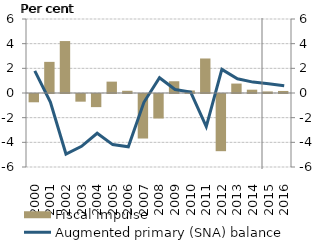
| Category | Fiscal impulse |
|---|---|
| 0 | -0.672 |
| 1900-01-01 | 2.524 |
| 1900-01-02 | 4.211 |
| 1900-01-03 | -0.622 |
| 1900-01-04 | -1.064 |
| 1900-01-05 | 0.922 |
| 1900-01-06 | 0.18 |
| 1900-01-07 | -3.61 |
| 1900-01-08 | -1.989 |
| 1900-01-09 | 0.952 |
| 1900-01-10 | 0.204 |
| 1900-01-11 | 2.798 |
| 1900-01-12 | -4.637 |
| 1900-01-13 | 0.765 |
| 1900-01-14 | 0.268 |
| 1900-01-15 | 0.127 |
| 1900-01-16 | 0.166 |